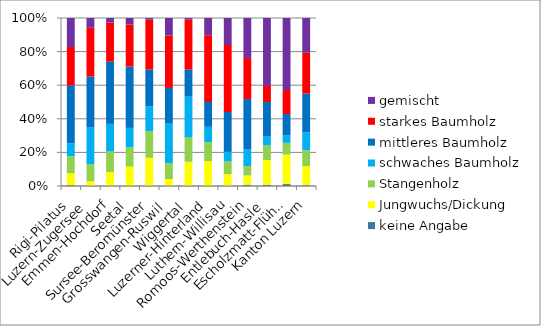
| Category | keine Angabe | Jungwuchs/Dickung | Stangenholz | schwaches Baumholz | mittleres Baumholz | starkes Baumholz | gemischt |
|---|---|---|---|---|---|---|---|
| Rigi-Pilatus | 25 | 378 | 529 | 403 | 1813 | 1209 | 907 |
| Luzern-Zugersee | 0 | 49 | 173 | 371 | 519 | 494 | 99 |
| Emmen-Hochdorf | 0 | 151 | 226 | 301 | 678 | 427 | 50 |
| Seetal | 0 | 149 | 149 | 149 | 472 | 323 | 50 |
| Sursee-Beromünster | 0 | 426 | 401 | 376 | 552 | 753 | 25 |
| Grosswangen-Ruswil | 0 | 99 | 222 | 568 | 494 | 740 | 247 |
| Wiggertal | 0 | 404 | 404 | 681 | 454 | 833 | 25 |
| Luzerner-Hinterland | 0 | 323 | 249 | 199 | 323 | 870 | 224 |
| Luthern-Willisau | 0 | 251 | 276 | 201 | 853 | 1431 | 577 |
| Romoos-Werthenstein | 25 | 199 | 199 | 348 | 1070 | 871 | 846 |
| Entlebuch-Hasle | 25 | 502 | 301 | 176 | 703 | 327 | 1382 |
| Escholzmatt-Flühli | 100 | 1497 | 599 | 374 | 1098 | 1222 | 3667 |
| Kanton Luzern | 175 | 4428 | 3728 | 4147 | 9029 | 9499 | 8098 |